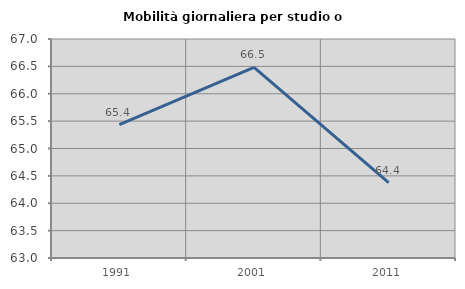
| Category | Mobilità giornaliera per studio o lavoro |
|---|---|
| 1991.0 | 65.436 |
| 2001.0 | 66.48 |
| 2011.0 | 64.378 |